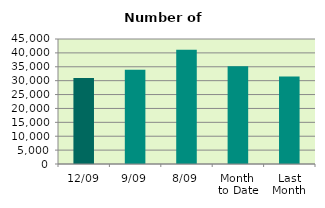
| Category | Series 0 |
|---|---|
| 12/09 | 30918 |
| 9/09 | 33954 |
| 8/09 | 41144 |
| Month 
to Date | 35208.75 |
| Last
Month | 31456 |